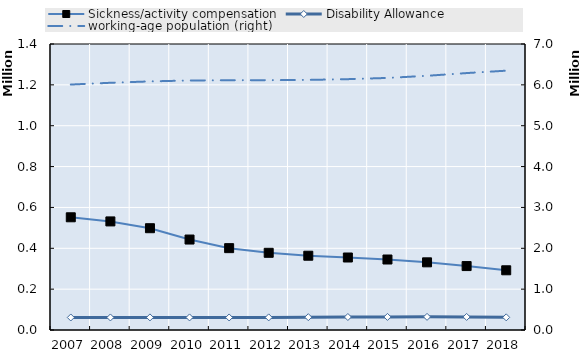
| Category | Sickness/activity compensation | Disability Allowance |
|---|---|---|
| 2007.0 | 551746 | 61293 |
| 2008.0 | 531506 | 61385 |
| 2009.0 | 498301 | 61661 |
| 2010.0 | 442812 | 61509 |
| 2011.0 | 400684 | 61390 |
| 2012.0 | 377865 | 61728 |
| 2013.0 | 363602 | 62846 |
| 2014.0 | 354828 | 63626 |
| 2015.0 | 345045 | 64062 |
| 2016.0 | 331236 | 64277 |
| 2017.0 | 312977 | 63990 |
| 2018.0 | 292318 | 61904 |